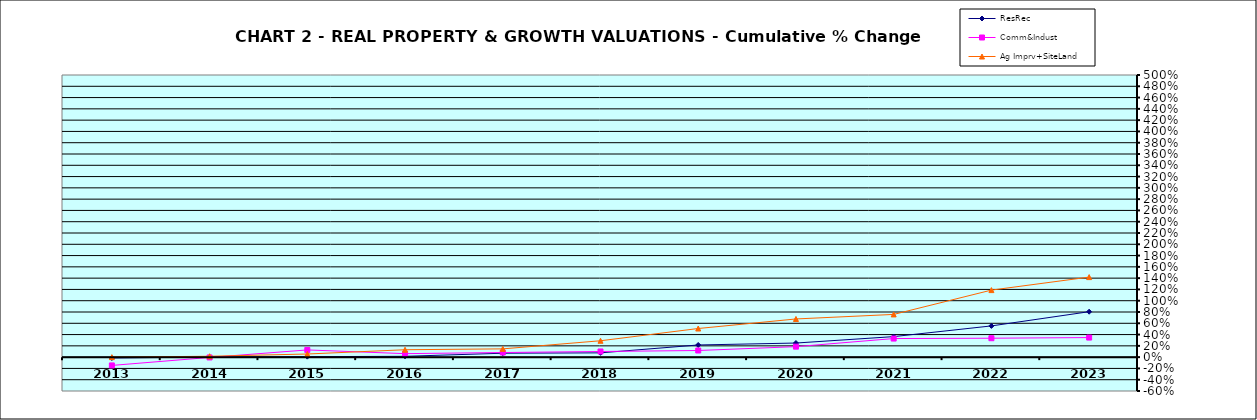
| Category | ResRec | Comm&Indust | Ag Imprv+SiteLand |
|---|---|---|---|
| 2013.0 | -0.015 | -0.147 | 0 |
| 2014.0 | 0.002 | -0.005 | 0.016 |
| 2015.0 | 0.009 | 0.128 | 0.055 |
| 2016.0 | 0.015 | 0.062 | 0.131 |
| 2017.0 | 0.069 | 0.082 | 0.147 |
| 2018.0 | 0.076 | 0.1 | 0.29 |
| 2019.0 | 0.216 | 0.117 | 0.507 |
| 2020.0 | 0.25 | 0.186 | 0.677 |
| 2021.0 | 0.364 | 0.329 | 0.757 |
| 2022.0 | 0.554 | 0.335 | 1.188 |
| 2023.0 | 0.805 | 0.347 | 1.418 |